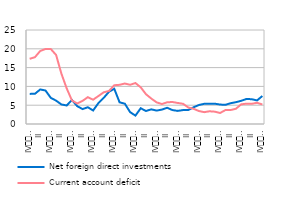
| Category | Net foreign direct investments | Current account deficit |
|---|---|---|
| IV
2007 | 8.007 | 17.335 |
| I | 8.035 | 17.769 |
| II | 9.188 | 19.419 |
| III | 8.903 | 19.947 |
| IV
2008 | 6.956 | 19.941 |
| I | 6.216 | 18.368 |
| II | 5.196 | 13.408 |
| III | 4.928 | 9.485 |
| IV
2009 | 6.365 | 6.254 |
| I | 4.743 | 5.448 |
| II | 3.966 | 6.144 |
| III | 4.456 | 7.133 |
| IV
2010 | 3.594 | 6.459 |
| I | 5.552 | 7.436 |
| II | 6.945 | 8.428 |
| III | 8.579 | 8.779 |
| IV
2011 | 9.364 | 10.313 |
| I | 5.774 | 10.421 |
| II | 5.392 | 10.762 |
| III | 3.153 | 10.432 |
| IV
2012 | 2.235 | 10.901 |
| I | 4.183 | 9.751 |
| II | 3.46 | 7.918 |
| III | 3.898 | 6.762 |
| IV
2013 | 3.564 | 5.761 |
| I | 3.83 | 5.308 |
| II | 4.313 | 5.776 |
| III | 3.703 | 5.85 |
| IV
2014 | 3.486 | 5.596 |
| I | 3.704 | 5.376 |
| II | 3.721 | 4.387 |
| III | 4.454 | 4.038 |
| IV
2015 | 5.05 | 3.454 |
| I | 5.369 | 3.149 |
| II | 5.378 | 3.384 |
| III | 5.404 | 3.279 |
| IV
2016 | 5.172 | 2.927 |
| I | 5.099 | 3.692 |
| II | 5.529 | 3.715 |
| III | 5.8 | 4.058 |
| IV
2017 | 6.166 | 5.23 |
| I | 6.662 | 5.409 |
| II | 6.593 | 5.375 |
| III | 6.266 | 5.638 |
| IV
2018 | 7.452 | 5.196 |